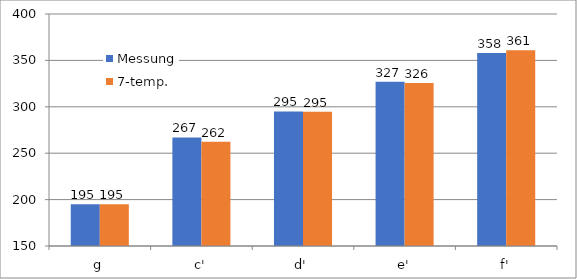
| Category | Messung | 7-temp. |
|---|---|---|
| g | 195 | 195 |
| c' | 267 | 262.451 |
| d' | 295 | 294.792 |
| e' | 327 | 325.706 |
| f' | 358 | 361.037 |